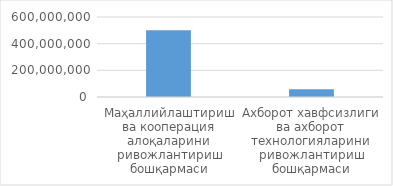
| Category | Товар / хизматнинг
жами суммаси
(cумда) 
(ҚҚС билан) |
|---|---|
| Маҳаллийлаштириш ва кооперация алоқаларини ривожлантириш бошқармаси | 500000000 |
| Ахборот хавфсизлиги ва ахборот технологияларини ривожлантириш бошқармаси | 57500000 |